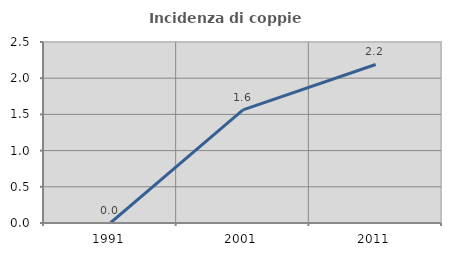
| Category | Incidenza di coppie miste |
|---|---|
| 1991.0 | 0 |
| 2001.0 | 1.562 |
| 2011.0 | 2.19 |